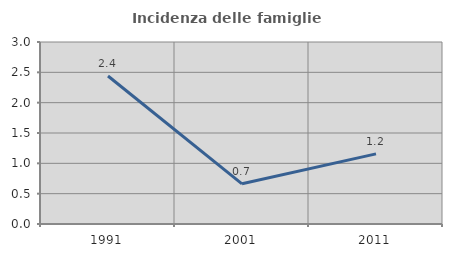
| Category | Incidenza delle famiglie numerose |
|---|---|
| 1991.0 | 2.439 |
| 2001.0 | 0.662 |
| 2011.0 | 1.155 |